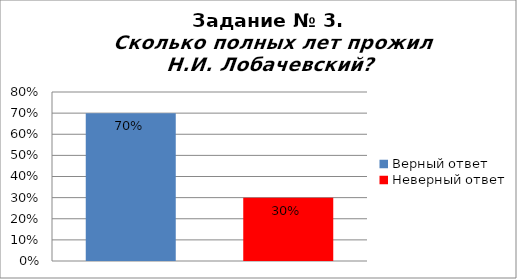
| Category | Сколько полных лет прожил Н.И. Лобачевский? |
|---|---|
| Верный ответ | 0.7 |
| Неверный ответ | 0.3 |